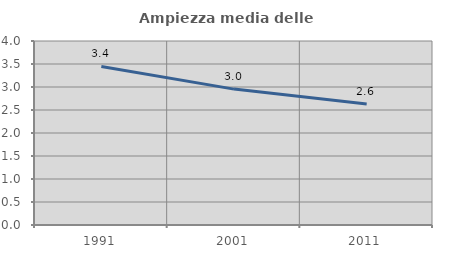
| Category | Ampiezza media delle famiglie |
|---|---|
| 1991.0 | 3.448 |
| 2001.0 | 2.954 |
| 2011.0 | 2.631 |